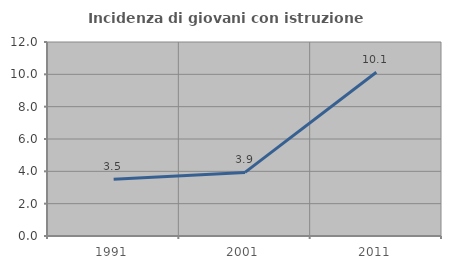
| Category | Incidenza di giovani con istruzione universitaria |
|---|---|
| 1991.0 | 3.509 |
| 2001.0 | 3.934 |
| 2011.0 | 10.132 |